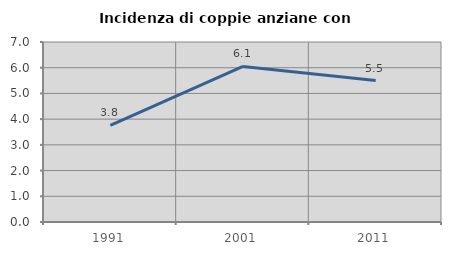
| Category | Incidenza di coppie anziane con figli |
|---|---|
| 1991.0 | 3.754 |
| 2001.0 | 6.051 |
| 2011.0 | 5.502 |